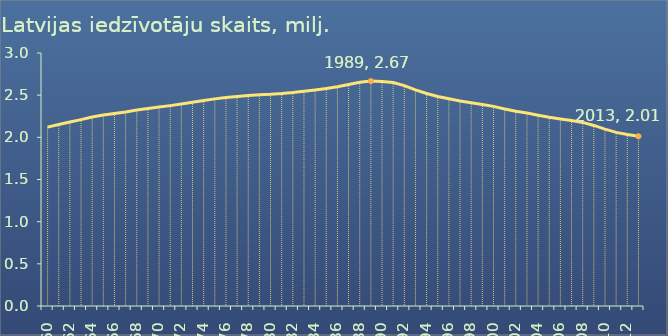
| Category | Latvijas iedzīvotāju skaits, milj. |
|---|---|
| 1960.0 | 2.121 |
| 1961.0 | 2.152 |
| 1962.0 | 2.181 |
| 1963.0 | 2.21 |
| 1964.0 | 2.24 |
| 1965.0 | 2.265 |
| 1966.0 | 2.283 |
| 1967.0 | 2.301 |
| 1968.0 | 2.323 |
| 1969.0 | 2.343 |
| 1970.0 | 2.359 |
| 1971.0 | 2.376 |
| 1972.0 | 2.395 |
| 1973.0 | 2.415 |
| 1974.0 | 2.437 |
| 1975.0 | 2.456 |
| 1976.0 | 2.471 |
| 1977.0 | 2.485 |
| 1978.0 | 2.497 |
| 1979.0 | 2.506 |
| 1980.0 | 2.511 |
| 1981.0 | 2.519 |
| 1982.0 | 2.531 |
| 1983.0 | 2.546 |
| 1984.0 | 2.562 |
| 1985.0 | 2.578 |
| 1986.0 | 2.599 |
| 1987.0 | 2.626 |
| 1988.0 | 2.653 |
| 1989.0 | 2.667 |
| 1990.0 | 2.663 |
| 1991.0 | 2.65 |
| 1992.0 | 2.614 |
| 1993.0 | 2.563 |
| 1994.0 | 2.52 |
| 1995.0 | 2.485 |
| 1996.0 | 2.457 |
| 1997.0 | 2.432 |
| 1998.0 | 2.41 |
| 1999.0 | 2.39 |
| 2000.0 | 2.367 |
| 2001.0 | 2.337 |
| 2002.0 | 2.31 |
| 2003.0 | 2.288 |
| 2004.0 | 2.263 |
| 2005.0 | 2.238 |
| 2006.0 | 2.218 |
| 2007.0 | 2.2 |
| 2008.0 | 2.177 |
| 2009.0 | 2.141 |
| 2010.0 | 2.097 |
| 2011.0 | 2.059 |
| 2012.0 | 2.034 |
| 2013.0 | 2.013 |